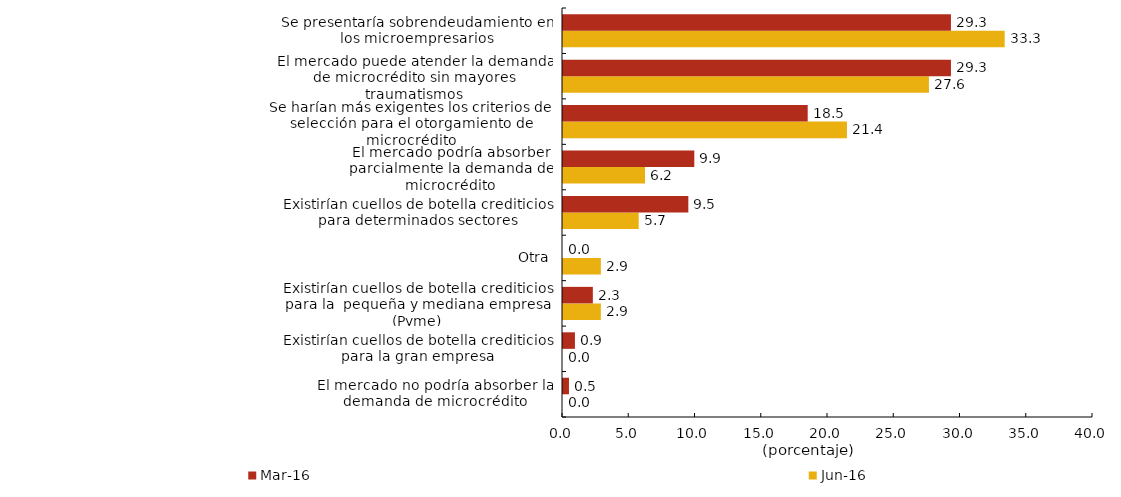
| Category | jun-16 | mar-16 |
|---|---|---|
| El mercado no podría absorber la demanda de microcrédito | 0 | 0.45 |
| Existirían cuellos de botella crediticios para la gran empresa | 0 | 0.901 |
| Existirían cuellos de botella crediticios para la  pequeña y mediana empresa (Pyme) | 2.857 | 2.252 |
| Otra | 2.857 | 0 |
| Existirían cuellos de botella crediticios para determinados sectores | 5.714 | 9.459 |
| El mercado podría absorber parcialmente la demanda de microcrédito | 6.19 | 9.91 |
| Se harían más exigentes los criterios de selección para el otorgamiento de microcrédito | 21.429 | 18.468 |
| El mercado puede atender la demanda de microcrédito sin mayores traumatismos | 27.619 | 29.279 |
| Se presentaría sobrendeudamiento en los microempresarios | 33.333 | 29.279 |